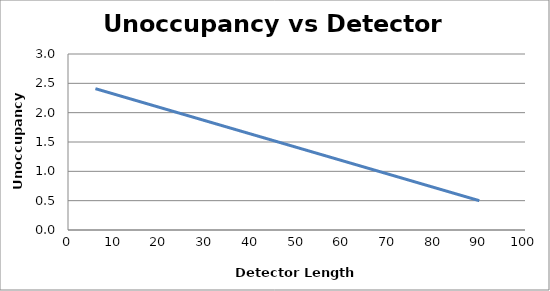
| Category | Unoccupancy (sec) |
|---|---|
| 6.0 | 2.409 |
| 7.0 | 2.386 |
| 8.0 | 2.364 |
| 9.0 | 2.341 |
| 10.0 | 2.318 |
| 11.0 | 2.295 |
| 12.0 | 2.273 |
| 13.0 | 2.25 |
| 14.0 | 2.227 |
| 15.0 | 2.205 |
| 16.0 | 2.182 |
| 17.0 | 2.159 |
| 18.0 | 2.136 |
| 19.0 | 2.114 |
| 20.0 | 2.091 |
| 21.0 | 2.068 |
| 22.0 | 2.045 |
| 23.0 | 2.023 |
| 24.0 | 2 |
| 25.0 | 1.977 |
| 26.0 | 1.954 |
| 27.0 | 1.932 |
| 28.0 | 1.909 |
| 29.0 | 1.886 |
| 30.0 | 1.864 |
| 31.0 | 1.841 |
| 32.0 | 1.818 |
| 33.0 | 1.795 |
| 34.0 | 1.773 |
| 35.0 | 1.75 |
| 36.0 | 1.727 |
| 37.0 | 1.704 |
| 38.0 | 1.682 |
| 39.0 | 1.659 |
| 40.0 | 1.636 |
| 41.0 | 1.614 |
| 42.0 | 1.591 |
| 43.0 | 1.568 |
| 44.0 | 1.545 |
| 45.0 | 1.523 |
| 46.0 | 1.5 |
| 47.0 | 1.477 |
| 48.0 | 1.454 |
| 49.0 | 1.432 |
| 50.0 | 1.409 |
| 51.0 | 1.386 |
| 52.0 | 1.364 |
| 53.0 | 1.341 |
| 54.0 | 1.318 |
| 55.0 | 1.295 |
| 56.0 | 1.273 |
| 57.0 | 1.25 |
| 58.0 | 1.227 |
| 59.0 | 1.204 |
| 60.0 | 1.182 |
| 61.0 | 1.159 |
| 62.0 | 1.136 |
| 63.0 | 1.114 |
| 64.0 | 1.091 |
| 65.0 | 1.068 |
| 66.0 | 1.045 |
| 67.0 | 1.023 |
| 68.0 | 1 |
| 69.0 | 0.977 |
| 70.0 | 0.954 |
| 71.0 | 0.932 |
| 72.0 | 0.909 |
| 73.0 | 0.886 |
| 74.0 | 0.864 |
| 75.0 | 0.841 |
| 76.0 | 0.818 |
| 77.0 | 0.795 |
| 78.0 | 0.773 |
| 79.0 | 0.75 |
| 80.0 | 0.727 |
| 81.0 | 0.704 |
| 82.0 | 0.682 |
| 83.0 | 0.659 |
| 84.0 | 0.636 |
| 85.0 | 0.614 |
| 86.0 | 0.591 |
| 87.0 | 0.568 |
| 88.0 | 0.545 |
| 89.0 | 0.523 |
| 90.0 | 0.5 |